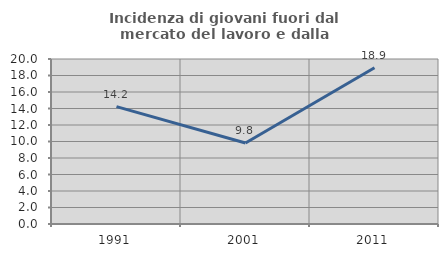
| Category | Incidenza di giovani fuori dal mercato del lavoro e dalla formazione  |
|---|---|
| 1991.0 | 14.229 |
| 2001.0 | 9.813 |
| 2011.0 | 18.947 |